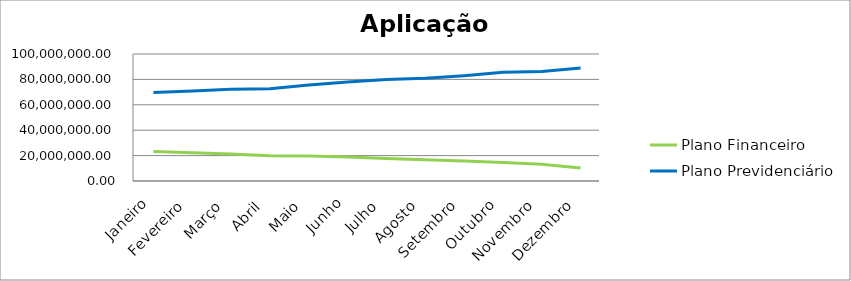
| Category | Plano Financeiro | Plano Previdenciário |
|---|---|---|
| Janeiro | 23186781.51 | 69653342.63 |
| Fevereiro | 22294751 | 70902302.37 |
| Março | 21348855.87 | 72178521.76 |
| Abril | 19919996.37 | 72561436.41 |
| Maio | 19656293.31 | 75508467.98 |
| Junho | 18842029.39 | 78040519.86 |
| Julho | 17701908.37 | 79876661.89 |
| Agosto | 16689948 | 80848882.34 |
| Setembro | 15689078.6 | 82965907.98 |
| Outubro | 14618420.15 | 85680027.3 |
| Novembro | 13149706.68 | 86180997.36 |
| Dezembro | 10323695.29 | 88892534.49 |